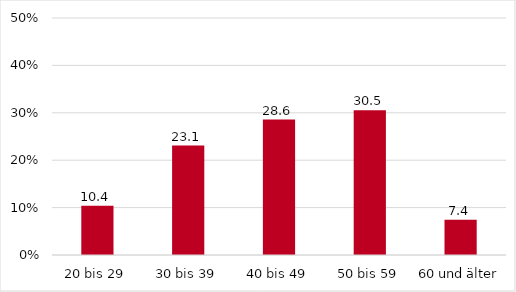
| Category | Series 0 |
|---|---|
| 20 bis 29 | 10.372 |
| 30 bis 39 | 23.092 |
| 40 bis 49 | 28.571 |
| 50 bis 59 | 30.528 |
| 60 und älter | 7.436 |